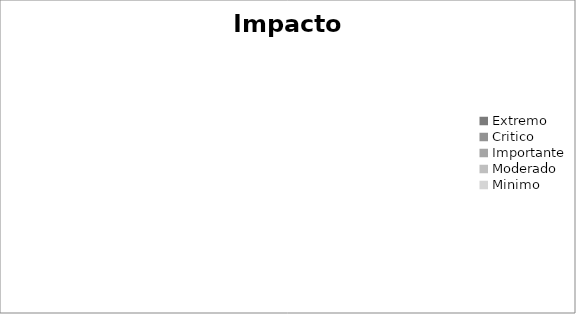
| Category | Series 0 |
|---|---|
| Extremo | 0 |
| Critico | 0 |
| Importante | 0 |
| Moderado | 0 |
| Minimo | 0 |